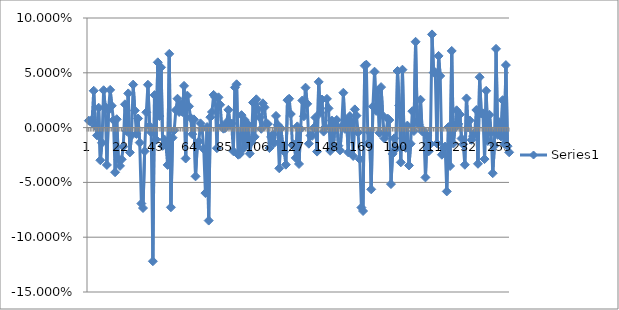
| Category | Series 0 |
|---|---|
| 0 | 0.006 |
| 1 | 0.005 |
| 2 | 0.007 |
| 3 | 0.034 |
| 4 | 0.002 |
| 5 | -0.007 |
| 6 | 0.018 |
| 7 | -0.03 |
| 8 | -0.014 |
| 9 | 0.034 |
| 10 | 0.019 |
| 11 | -0.034 |
| 12 | 0.016 |
| 13 | 0.034 |
| 14 | 0.02 |
| 15 | 0.007 |
| 16 | -0.041 |
| 17 | 0.008 |
| 18 | -0.029 |
| 19 | -0.035 |
| 20 | -0.029 |
| 21 | -0.017 |
| 22 | 0.021 |
| 23 | -0.003 |
| 24 | 0.031 |
| 25 | -0.023 |
| 26 | -0.007 |
| 27 | 0.039 |
| 28 | 0.016 |
| 29 | -0.006 |
| 30 | 0.008 |
| 31 | -0.014 |
| 32 | -0.069 |
| 33 | -0.073 |
| 34 | -0.022 |
| 35 | 0.014 |
| 36 | 0.039 |
| 37 | 0.002 |
| 38 | -0.004 |
| 39 | -0.122 |
| 40 | 0.03 |
| 41 | -0.011 |
| 42 | 0.06 |
| 43 | 0.011 |
| 44 | 0.055 |
| 45 | -0.017 |
| 46 | -0.011 |
| 47 | -0.016 |
| 48 | -0.034 |
| 49 | 0.067 |
| 50 | -0.073 |
| 51 | -0.009 |
| 52 | -0.002 |
| 53 | 0.016 |
| 54 | 0.026 |
| 55 | 0.014 |
| 56 | 0.021 |
| 57 | 0.014 |
| 58 | 0.038 |
| 59 | -0.028 |
| 60 | 0.029 |
| 61 | 0.019 |
| 62 | 0.009 |
| 63 | -0.006 |
| 64 | 0.007 |
| 65 | -0.044 |
| 66 | -0.017 |
| 67 | -0.013 |
| 68 | 0.004 |
| 69 | -0.001 |
| 70 | -0.02 |
| 71 | -0.06 |
| 72 | 0.001 |
| 73 | -0.085 |
| 74 | 0.01 |
| 75 | 0.014 |
| 76 | 0.03 |
| 77 | 0.028 |
| 78 | -0.019 |
| 79 | 0.028 |
| 80 | 0.021 |
| 81 | 0.001 |
| 82 | -0.001 |
| 83 | 0 |
| 84 | 0.005 |
| 85 | 0.016 |
| 86 | 0.002 |
| 87 | 0.004 |
| 88 | -0.022 |
| 89 | 0.037 |
| 90 | 0.04 |
| 91 | -0.025 |
| 92 | -0.024 |
| 93 | 0.011 |
| 94 | -0.019 |
| 95 | 0.007 |
| 96 | -0.015 |
| 97 | 0.003 |
| 98 | -0.024 |
| 99 | -0.013 |
| 100 | 0.023 |
| 101 | -0.008 |
| 102 | 0.026 |
| 103 | 0.017 |
| 104 | 0.009 |
| 105 | -0.001 |
| 106 | 0.022 |
| 107 | 0.018 |
| 108 | 0.004 |
| 109 | 0.003 |
| 110 | -0.019 |
| 111 | -0.009 |
| 112 | -0.006 |
| 113 | -0.014 |
| 114 | 0.011 |
| 115 | 0.003 |
| 116 | -0.037 |
| 117 | -0.001 |
| 118 | -0.016 |
| 119 | -0.022 |
| 120 | -0.034 |
| 121 | 0.025 |
| 122 | 0.026 |
| 123 | 0.012 |
| 124 | -0.016 |
| 125 | -0.016 |
| 126 | -0.028 |
| 127 | 0.001 |
| 128 | -0.033 |
| 129 | -0.001 |
| 130 | 0.025 |
| 131 | 0.01 |
| 132 | 0.036 |
| 133 | 0.022 |
| 134 | -0.015 |
| 135 | -0.007 |
| 136 | -0.008 |
| 137 | 0 |
| 138 | 0.009 |
| 139 | -0.022 |
| 140 | 0.042 |
| 141 | 0.014 |
| 142 | 0.026 |
| 143 | -0.004 |
| 144 | 0 |
| 145 | 0.026 |
| 146 | 0.018 |
| 147 | -0.021 |
| 148 | 0.006 |
| 149 | -0.017 |
| 150 | 0.003 |
| 151 | 0.007 |
| 152 | -0.017 |
| 153 | -0.021 |
| 154 | 0.001 |
| 155 | 0.032 |
| 156 | -0.001 |
| 157 | 0.006 |
| 158 | -0.023 |
| 159 | 0.011 |
| 160 | 0.005 |
| 161 | -0.026 |
| 162 | 0.017 |
| 163 | 0.011 |
| 164 | -0.004 |
| 165 | -0.029 |
| 166 | -0.073 |
| 167 | -0.076 |
| 168 | 0.056 |
| 169 | 0.057 |
| 170 | -0.014 |
| 171 | -0.004 |
| 172 | -0.056 |
| 173 | 0.019 |
| 174 | 0.051 |
| 175 | 0.015 |
| 176 | 0.034 |
| 177 | -0.005 |
| 178 | 0.037 |
| 179 | 0.011 |
| 180 | -0.01 |
| 181 | -0.006 |
| 182 | 0.008 |
| 183 | 0.007 |
| 184 | -0.052 |
| 185 | -0.024 |
| 186 | -0.01 |
| 187 | -0.019 |
| 188 | 0.052 |
| 189 | 0.02 |
| 190 | -0.032 |
| 191 | 0.053 |
| 192 | -0.011 |
| 193 | -0.018 |
| 194 | 0.002 |
| 195 | -0.035 |
| 196 | -0.015 |
| 197 | 0.015 |
| 198 | -0.003 |
| 199 | 0.078 |
| 200 | 0.006 |
| 201 | 0.002 |
| 202 | 0.025 |
| 203 | -0.003 |
| 204 | -0.003 |
| 205 | -0.045 |
| 206 | -0.007 |
| 207 | -0.022 |
| 208 | -0.015 |
| 209 | 0.085 |
| 210 | 0.05 |
| 211 | 0.051 |
| 212 | -0.014 |
| 213 | 0.065 |
| 214 | 0.047 |
| 215 | -0.025 |
| 216 | -0.019 |
| 217 | -0.017 |
| 218 | -0.058 |
| 219 | 0 |
| 220 | -0.035 |
| 221 | 0.07 |
| 222 | -0.015 |
| 223 | 0 |
| 224 | 0.016 |
| 225 | 0.003 |
| 226 | 0.012 |
| 227 | -0.01 |
| 228 | -0.015 |
| 229 | -0.034 |
| 230 | 0.027 |
| 231 | 0 |
| 232 | 0.007 |
| 233 | -0.011 |
| 234 | -0.008 |
| 235 | -0.005 |
| 236 | 0.016 |
| 237 | -0.033 |
| 238 | 0.046 |
| 239 | 0.013 |
| 240 | 0.013 |
| 241 | -0.029 |
| 242 | 0.034 |
| 243 | -0.012 |
| 244 | 0.012 |
| 245 | -0.004 |
| 246 | -0.042 |
| 247 | -0.017 |
| 248 | 0.072 |
| 249 | -0.007 |
| 250 | 0.005 |
| 251 | -0.008 |
| 252 | 0.025 |
| 253 | -0.015 |
| 254 | 0.057 |
| 255 | -0.017 |
| 256 | -0.023 |